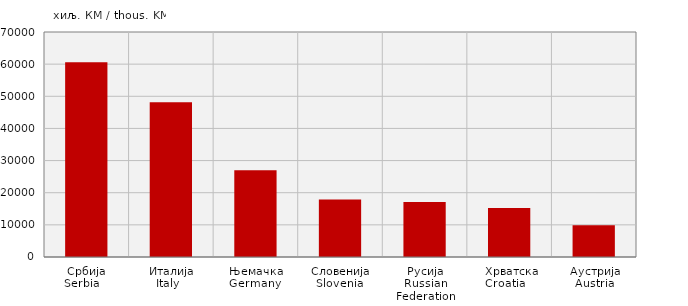
| Category | Увоз
Import |
|---|---|
| Србија
Serbia    | 60566 |
| Италија
Italy   | 48175 |
| Њемачка
Germany  | 26991 |
| Словенија
Slovenia  | 17911 |
| Русија
Russian Federation | 17112 |
|  Хрватска
Croatia    | 15213 |
| Аустрија
Austria | 9856 |